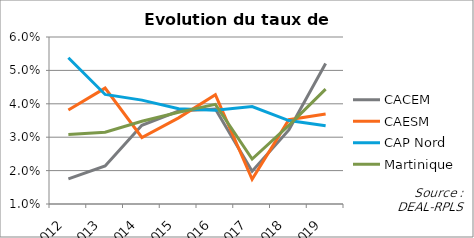
| Category | CACEM | CAESM | CAP Nord | Martinique |
|---|---|---|---|---|
| 2012.0 | 0.018 | 0.038 | 0.054 | 0.031 |
| 2013.0 | 0.021 | 0.045 | 0.043 | 0.032 |
| 2014.0 | 0.034 | 0.03 | 0.041 | 0.035 |
| 2015.0 | 0.038 | 0.036 | 0.038 | 0.037 |
| 2016.0 | 0.038 | 0.043 | 0.038 | 0.04 |
| 2017.0 | 0.02 | 0.017 | 0.039 | 0.023 |
| 2018.0 | 0.032 | 0.035 | 0.035 | 0.034 |
| 2019.0 | 0.052 | 0.037 | 0.033 | 0.044 |